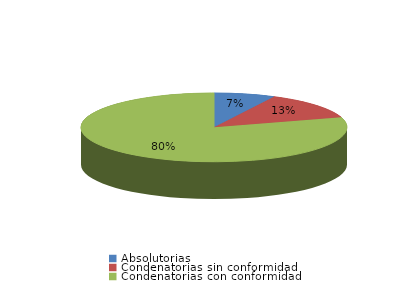
| Category | Series 0 |
|---|---|
| Absolutorias | 11 |
| Condenatorias sin conformidad | 19 |
| Condenatorias con conformidad | 118 |